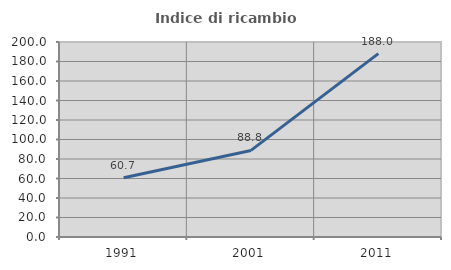
| Category | Indice di ricambio occupazionale  |
|---|---|
| 1991.0 | 60.732 |
| 2001.0 | 88.794 |
| 2011.0 | 188.043 |